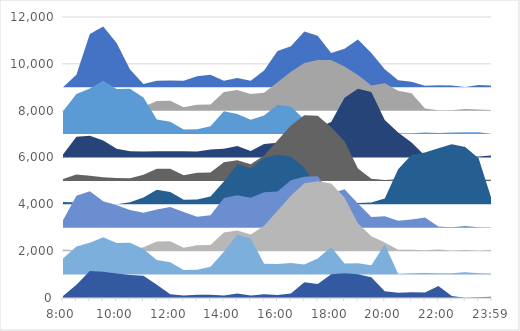
| Category | Продажи | Маркетинг | Производство | Логистика | Техслужба | ИТ | Финансы | Бухгалтерия | Безопасность | Управление |
|---|---|---|---|---|---|---|---|---|---|---|
| 0.333333333333333 | 9000 | 8000 | 7000 | 6000 | 5000 | 4000 | 3000 | 2000 | 1000 | 0 |
| nan | 9000 | 8000 | 7000 | 6000 | 5000 | 4000 | 3000 | 2000 | 1000 | 0 |
| nan | 9000 | 8000 | 7000 | 6000 | 5000 | 4000 | 3000 | 2000 | 1000 | 0 |
| nan | 9000 | 8000 | 7000 | 6000 | 5000 | 4000 | 3000 | 2000 | 1000 | 0 |
| 0.416666666666667 | 9000 | 8000 | 7000 | 6000 | 5000 | 4000 | 3000 | 2000 | 1000 | 0 |
| nan | 9000 | 8000 | 7000 | 6000 | 5000 | 4000 | 3000 | 2000 | 1000 | 0 |
| nan | 9000 | 8000 | 7000 | 6000 | 5000 | 4000 | 3000 | 2000 | 1000 | 0 |
| nan | 9000 | 8000 | 7000 | 6000 | 5000 | 4000 | 3000 | 2000 | 1000 | 0 |
| 0.5 | 9000 | 8000 | 7000 | 6000 | 5000 | 4000 | 3000 | 2000 | 1000 | 0 |
| nan | 9000 | 8000 | 7000 | 6000 | 5000 | 4000 | 3000 | 2000 | 1000 | 0 |
| nan | 9000 | 8000 | 7000 | 6000 | 5000 | 4000 | 3000 | 2000 | 1000 | 0 |
| nan | 9000 | 8000 | 7000 | 6000 | 5000 | 4000 | 3000 | 2000 | 1000 | 0 |
| 0.583333333333333 | 9000 | 8000 | 7000 | 6000 | 5000 | 4000 | 3000 | 2000 | 1000 | 0 |
| nan | 9000 | 8000 | 7000 | 6000 | 5000 | 4000 | 3000 | 2000 | 1000 | 0 |
| nan | 9000 | 8000 | 7000 | 6000 | 5000 | 4000 | 3000 | 2000 | 1000 | 0 |
| nan | 9000 | 8000 | 7000 | 6000 | 5000 | 4000 | 3000 | 2000 | 1000 | 0 |
| 0.666666666666667 | 9000 | 8000 | 7000 | 6000 | 5000 | 4000 | 3000 | 2000 | 1000 | 0 |
| nan | 9000 | 8000 | 7000 | 6000 | 5000 | 4000 | 3000 | 2000 | 1000 | 0 |
| nan | 9000 | 8000 | 7000 | 6000 | 5000 | 4000 | 3000 | 2000 | 1000 | 0 |
| nan | 9000 | 8000 | 7000 | 6000 | 5000 | 4000 | 3000 | 2000 | 1000 | 0 |
| 0.75 | 9000 | 8000 | 7000 | 6000 | 5000 | 4000 | 3000 | 2000 | 1000 | 0 |
| nan | 9000 | 8000 | 7000 | 6000 | 5000 | 4000 | 3000 | 2000 | 1000 | 0 |
| nan | 9000 | 8000 | 7000 | 6000 | 5000 | 4000 | 3000 | 2000 | 1000 | 0 |
| nan | 9000 | 8000 | 7000 | 6000 | 5000 | 4000 | 3000 | 2000 | 1000 | 0 |
| 0.833333333333333 | 9000 | 8000 | 7000 | 6000 | 5000 | 4000 | 3000 | 2000 | 1000 | 0 |
| nan | 9000 | 8000 | 7000 | 6000 | 5000 | 4000 | 3000 | 2000 | 1000 | 0 |
| nan | 9000 | 8000 | 7000 | 6000 | 5000 | 4000 | 3000 | 2000 | 1000 | 0 |
| nan | 9000 | 8000 | 7000 | 6000 | 5000 | 4000 | 3000 | 2000 | 1000 | 0 |
| 0.916666666666667 | 9000 | 8000 | 7000 | 6000 | 5000 | 4000 | 3000 | 2000 | 1000 | 0 |
| nan | 9000 | 8000 | 7000 | 6000 | 5000 | 4000 | 3000 | 2000 | 1000 | 0 |
| nan | 9000 | 8000 | 7000 | 6000 | 5000 | 4000 | 3000 | 2000 | 1000 | 0 |
| nan | 9000 | 8000 | 7000 | 6000 | 5000 | 4000 | 3000 | 2000 | 1000 | 0 |
| 0.9993055555555556 | 9000 | 8000 | 7000 | 6000 | 5000 | 4000 | 3000 | 2000 | 1000 | 0 |